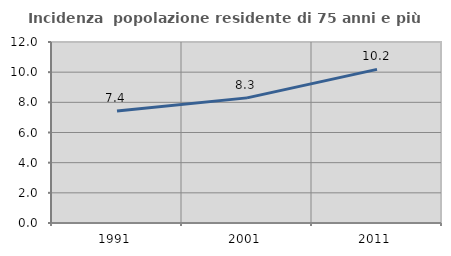
| Category | Incidenza  popolazione residente di 75 anni e più |
|---|---|
| 1991.0 | 7.422 |
| 2001.0 | 8.296 |
| 2011.0 | 10.183 |